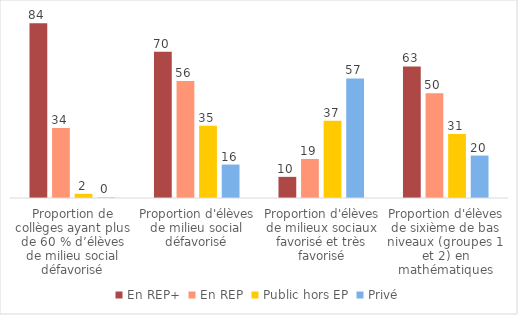
| Category | En REP+ | En REP | Public hors EP | Privé |
|---|---|---|---|---|
| Proportion de collèges ayant plus de 60 % d’élèves de milieu social défavorisé | 83.657 | 33.516 | 2.012 | 0.241 |
| Proportion d'élèves de milieu social défavorisé | 69.967 | 55.989 | 34.578 | 16.011 |
| Proportion d'élèves de milieux sociaux favorisé et très favorisé | 10.122 | 18.667 | 36.956 | 57.218 |
| Proportion d'élèves de sixième de bas niveaux (groupes 1 et 2) en mathématiques | 63 | 50.2 | 30.6 | 20.3 |